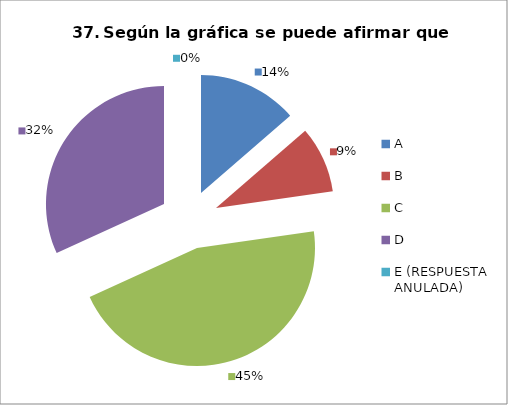
| Category | CANTIDAD DE RESPUESTAS PREGUNTA (37) | PORCENTAJE |
|---|---|---|
| A | 3 | 0.136 |
| B | 2 | 0.091 |
| C | 10 | 0.455 |
| D | 7 | 0.318 |
| E (RESPUESTA ANULADA) | 0 | 0 |